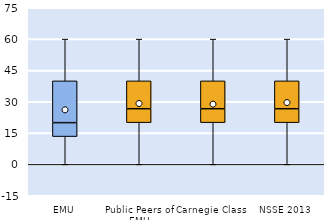
| Category | 25th | 50th | 75th |
|---|---|---|---|
| EMU | 13.333 | 6.667 | 20 |
| Public Peers of EMU | 20 | 6.667 | 13.333 |
| Carnegie Class | 20 | 6.667 | 13.333 |
| NSSE 2013 | 20 | 6.667 | 13.333 |